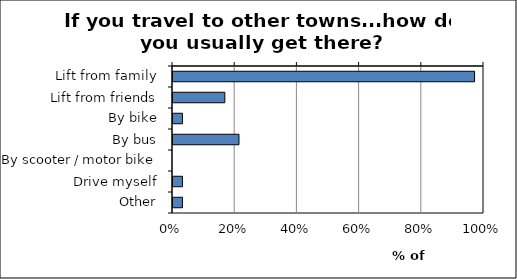
| Category | Series 0 |
|---|---|
| Lift from family | 0.97 |
| Lift from friends | 0.167 |
| By bike | 0.03 |
| By bus | 0.212 |
| By scooter / motor bike | 0 |
| Drive myself | 0.03 |
| Other | 0.03 |